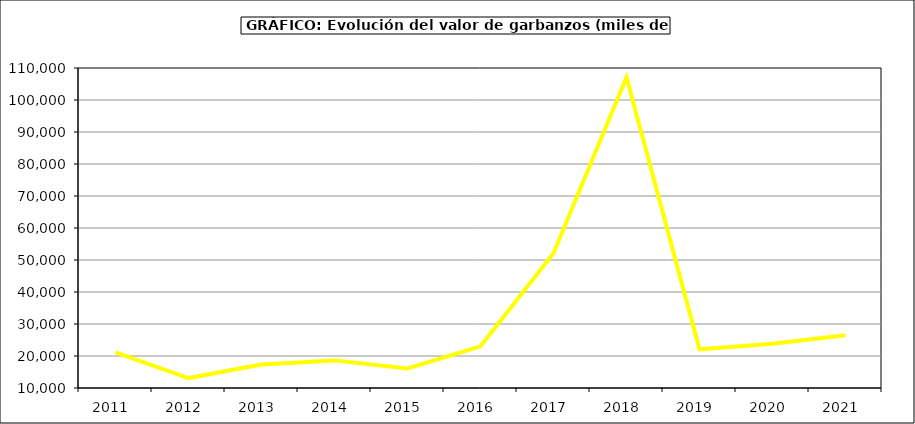
| Category | Valor |
|---|---|
| 2011.0 | 21152.702 |
| 2012.0 | 13103.626 |
| 2013.0 | 17341.152 |
| 2014.0 | 18630.56 |
| 2015.0 | 16111 |
| 2016.0 | 23017 |
| 2017.0 | 52130.705 |
| 2018.0 | 107140.704 |
| 2019.0 | 22077.188 |
| 2020.0 | 23849.484 |
| 2021.0 | 26518.862 |